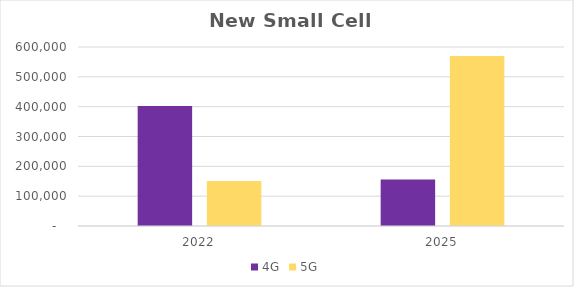
| Category | 4G | 5G |
|---|---|---|
| 2022.0 | 402000 | 151000 |
| 2025.0 | 156000 | 570000 |